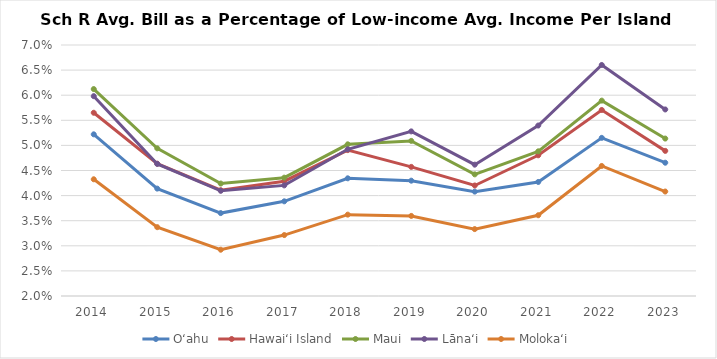
| Category | Oʻahu | Hawaiʻi Island | Maui | Lānaʻi | Molokaʻi |
|---|---|---|---|---|---|
| 2014.0 | 0.052 | 0.057 | 0.061 | 0.06 | 0.043 |
| 2015.0 | 0.041 | 0.046 | 0.049 | 0.046 | 0.034 |
| 2016.0 | 0.037 | 0.041 | 0.042 | 0.041 | 0.029 |
| 2017.0 | 0.039 | 0.043 | 0.044 | 0.042 | 0.032 |
| 2018.0 | 0.043 | 0.049 | 0.05 | 0.049 | 0.036 |
| 2019.0 | 0.043 | 0.046 | 0.051 | 0.053 | 0.036 |
| 2020.0 | 0.041 | 0.042 | 0.044 | 0.046 | 0.033 |
| 2021.0 | 0.043 | 0.048 | 0.049 | 0.054 | 0.036 |
| 2022.0 | 0.052 | 0.057 | 0.059 | 0.066 | 0.046 |
| 2023.0 | 0.047 | 0.049 | 0.051 | 0.057 | 0.041 |